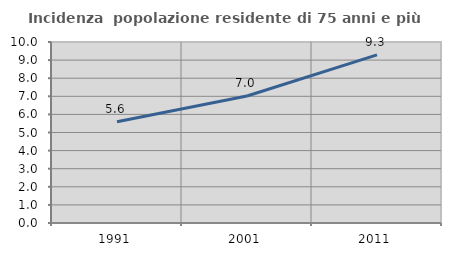
| Category | Incidenza  popolazione residente di 75 anni e più |
|---|---|
| 1991.0 | 5.595 |
| 2001.0 | 7.015 |
| 2011.0 | 9.29 |